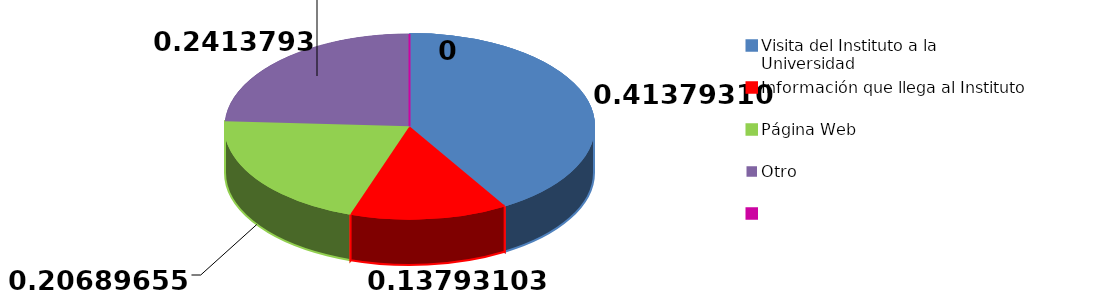
| Category | Sí | No |
|---|---|---|
| Visita del Instituto a la Universidad | 12 | 96 |
| Información que llega al Instituto | 4 | 97 |
| Página Web | 6 | 98 |
| Otro | 7 | 99 |